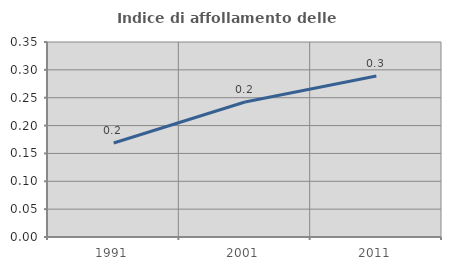
| Category | Indice di affollamento delle abitazioni  |
|---|---|
| 1991.0 | 0.169 |
| 2001.0 | 0.242 |
| 2011.0 | 0.289 |